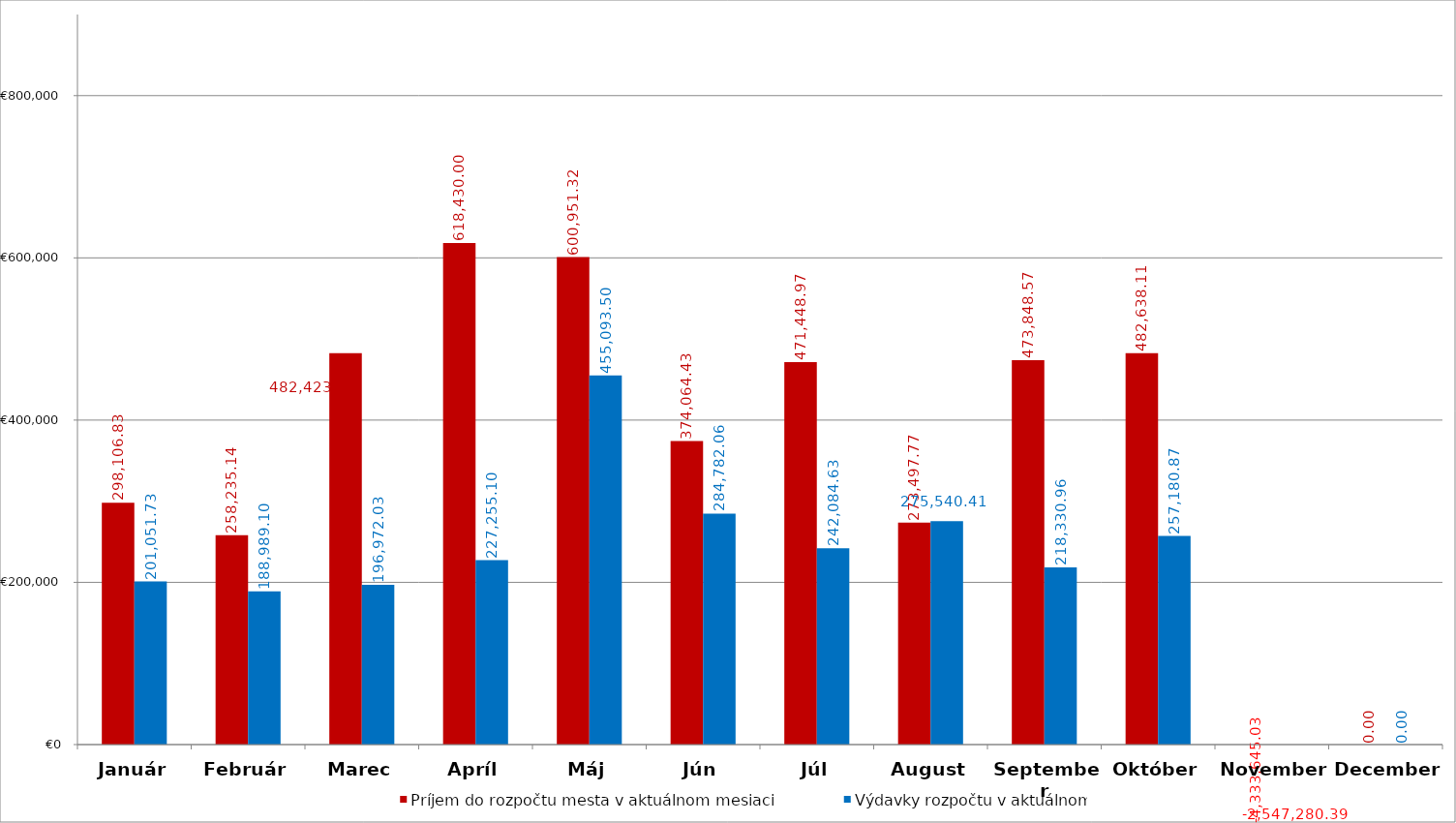
| Category | Príjem do rozpočtu mesta v aktuálnom mesiaci | Výdavky rozpočtu v aktuálnom  mesiaci |
|---|---|---|
| Január | 298106.83 | 201051.73 |
| Február | 258235.14 | 188989.1 |
| Marec | 482423.889 | 196972.03 |
| Apríl | 618430.001 | 227255.1 |
| Máj | 600951.32 | 455093.5 |
| Jún | 374064.43 | 284782.06 |
| Júl | 471448.97 | 242084.63 |
| August | 273497.77 | 275540.41 |
| September | 473848.57 | 218330.96 |
| Október | 482638.11 | 257180.87 |
| November | -4333645.03 | -2547280.39 |
| December | 0 | 0 |